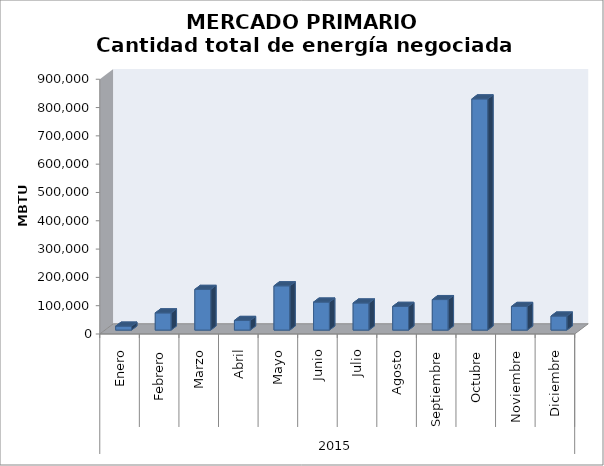
| Category | Cantidad Total
(MBTU) |
|---|---|
| 0 | 13894 |
| 1 | 60650 |
| 2 | 143661 |
| 3 | 33977 |
| 4 | 156281 |
| 5 | 98809 |
| 6 | 95621 |
| 7 | 83681 |
| 8 | 107679 |
| 9 | 816596 |
| 10 | 83434 |
| 11 | 49500 |